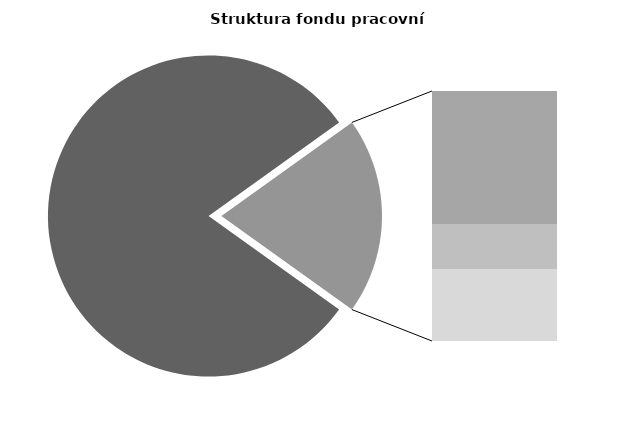
| Category | Series 0 |
|---|---|
| Průměrná měsíční odpracovaná doba bez přesčasu | 138.1 |
| Dovolená | 18.153 |
| Nemoc | 6.123 |
| Jiné | 9.819 |